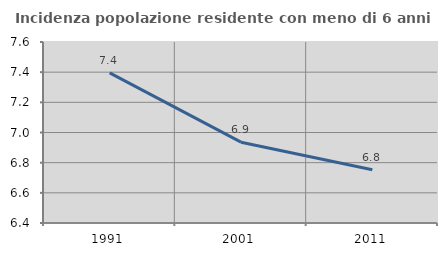
| Category | Incidenza popolazione residente con meno di 6 anni |
|---|---|
| 1991.0 | 7.395 |
| 2001.0 | 6.936 |
| 2011.0 | 6.753 |